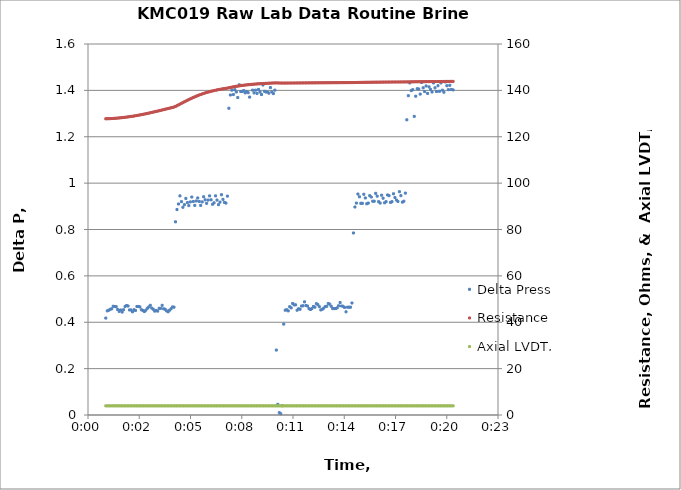
| Category | Delta Press |
|---|---|
| 0.0006944444444444445 | 0.418 |
| 0.0007523148137907912 | 0.449 |
| 0.0008101851904130955 | 0.452 |
| 0.0008680555597594422 | 0.456 |
| 0.0009259259291057889 | 0.458 |
| 0.0009837962984521357 | 0.469 |
| 0.0010416666677984824 | 0.468 |
| 0.0010995370371448291 | 0.467 |
| 0.0011574074064911758 | 0.455 |
| 0.0012152777831134802 | 0.447 |
| 0.0012731481524598269 | 0.453 |
| 0.0013310185218061736 | 0.444 |
| 0.0013888888911525203 | 0.454 |
| 0.001446759260498867 | 0.468 |
| 0.0015046296298452137 | 0.472 |
| 0.0015624999991915604 | 0.47 |
| 0.0016203703758138647 | 0.453 |
| 0.0016782407451602114 | 0.453 |
| 0.0017361111145065581 | 0.445 |
| 0.0017939814838529048 | 0.454 |
| 0.0018518518531992515 | 0.451 |
| 0.0019097222225455983 | 0.468 |
| 0.001967592591891945 | 0.468 |
| 0.0020254629685142493 | 0.466 |
| 0.002083333337860596 | 0.454 |
| 0.0021412037072069427 | 0.451 |
| 0.0021990740765532894 | 0.446 |
| 0.002256944445899636 | 0.452 |
| 0.002314814815245983 | 0.46 |
| 0.0023726851845923295 | 0.466 |
| 0.0024305555539386762 | 0.473 |
| 0.0024884259305609805 | 0.461 |
| 0.0025462962999073272 | 0.456 |
| 0.002604166669253674 | 0.448 |
| 0.0026620370386000207 | 0.451 |
| 0.0027199074079463674 | 0.448 |
| 0.002777777777292714 | 0.46 |
| 0.0028356481466390608 | 0.46 |
| 0.002893518523261365 | 0.473 |
| 0.002951388892607712 | 0.458 |
| 0.0030092592619540585 | 0.456 |
| 0.003067129631300405 | 0.449 |
| 0.003125000000646752 | 0.445 |
| 0.0031828703699930986 | 0.452 |
| 0.0032407407393394453 | 0.458 |
| 0.0032986111159617497 | 0.466 |
| 0.0033564814853080964 | 0.465 |
| 0.003414351854654443 | 0.833 |
| 0.0034722222240007898 | 0.886 |
| 0.0035300925933471365 | 0.91 |
| 0.003587962962693483 | 0.945 |
| 0.00364583333203983 | 0.92 |
| 0.003703703708662134 | 0.896 |
| 0.003761574078008481 | 0.907 |
| 0.0038194444473548276 | 0.934 |
| 0.0038773148167011743 | 0.916 |
| 0.003935185186047521 | 0.903 |
| 0.003993055555393868 | 0.919 |
| 0.0040509259247402144 | 0.94 |
| 0.004108796301362519 | 0.921 |
| 0.0041666666707088655 | 0.904 |
| 0.004224537040055212 | 0.923 |
| 0.004282407409401559 | 0.936 |
| 0.004340277778747906 | 0.921 |
| 0.004398148148094252 | 0.904 |
| 0.004456018517440599 | 0.919 |
| 0.004513888894062903 | 0.941 |
| 0.00457175926340925 | 0.928 |
| 0.004629629632755597 | 0.913 |
| 0.0046875000021019434 | 0.927 |
| 0.00474537037144829 | 0.945 |
| 0.004803240740794637 | 0.928 |
| 0.0048611111101409836 | 0.909 |
| 0.004918981486763288 | 0.915 |
| 0.004976851856109635 | 0.945 |
| 0.005034722225455981 | 0.927 |
| 0.005092592594802328 | 0.907 |
| 0.005150462964148675 | 0.918 |
| 0.005208333333495021 | 0.95 |
| 0.005266203702841368 | 0.93 |
| 0.0053240740794636724 | 0.917 |
| 0.005381944448810019 | 0.914 |
| 0.005439814818156366 | 0.944 |
| 0.0054976851875027126 | 1.323 |
| 0.005555555556849059 | 1.38 |
| 0.005613425926195406 | 1.401 |
| 0.005671296295541753 | 1.382 |
| 0.005729166672164057 | 1.403 |
| 0.005787037041510404 | 1.393 |
| 0.00584490741085675 | 1.369 |
| 0.005902777780203097 | 1.424 |
| 0.005960648149549444 | 1.395 |
| 0.0060185185188957905 | 1.395 |
| 0.006076388888242137 | 1.399 |
| 0.0061342592648644416 | 1.389 |
| 0.006192129634210788 | 1.395 |
| 0.006250000003557135 | 1.39 |
| 0.006307870372903482 | 1.371 |
| 0.006365740742249828 | 1.425 |
| 0.006423611111596175 | 1.401 |
| 0.006481481480942522 | 1.389 |
| 0.0065393518502888685 | 1.401 |
| 0.006597222226911173 | 1.387 |
| 0.0066550925962575195 | 1.404 |
| 0.006712962965603866 | 1.393 |
| 0.006770833334950213 | 1.382 |
| 0.00682870370429656 | 1.423 |
| 0.006886574073642906 | 1.396 |
| 0.006944444442989253 | 1.393 |
| 0.007002314819611557 | 1.393 |
| 0.007060185188957904 | 1.388 |
| 0.007118055558304251 | 1.412 |
| 0.0071759259276505975 | 1.393 |
| 0.007233796296996944 | 1.386 |
| 0.007291666666343291 | 1.401 |
| 0.007349537035689638 | 0.28 |
| 0.007407407412311942 | 0.046 |
| 0.007465277781658289 | 0.01 |
| 0.007523148151004635 | 0.005 |
| 0.007581018520350982 | 0.04 |
| 0.007638888889697329 | 0.392 |
| 0.0076967592590436755 | 0.452 |
| 0.007754629628390022 | 0.454 |
| 0.007812500005012327 | 0.449 |
| 0.007870370374358674 | 0.467 |
| 0.00792824074370502 | 0.462 |
| 0.007986111113051367 | 0.481 |
| 0.008043981482397714 | 0.475 |
| 0.008101851851744061 | 0.475 |
| 0.008159722221090408 | 0.452 |
| 0.008217592597712712 | 0.458 |
| 0.008275462967059059 | 0.456 |
| 0.008333333336405405 | 0.47 |
| 0.008391203705751752 | 0.471 |
| 0.008449074075098099 | 0.488 |
| 0.008506944444444445 | 0.472 |
| 0.008564814813790792 | 0.47 |
| 0.008622685190413096 | 0.459 |
| 0.008680555559759443 | 0.455 |
| 0.00873842592910579 | 0.459 |
| 0.008796296298452137 | 0.468 |
| 0.008854166667798483 | 0.465 |
| 0.00891203703714483 | 0.48 |
| 0.008969907406491177 | 0.476 |
| 0.009027777783113481 | 0.467 |
| 0.009085648152459828 | 0.453 |
| 0.009143518521806174 | 0.456 |
| 0.009201388891152521 | 0.461 |
| 0.009259259260498868 | 0.468 |
| 0.009317129629845215 | 0.469 |
| 0.009374999999191561 | 0.481 |
| 0.009432870375813866 | 0.478 |
| 0.009490740745160212 | 0.469 |
| 0.009548611114506559 | 0.459 |
| 0.009606481483852906 | 0.459 |
| 0.009664351853199252 | 0.459 |
| 0.009722222222545599 | 0.462 |
| 0.009780092591891946 | 0.471 |
| 0.00983796296851425 | 0.485 |
| 0.009895833337860597 | 0.47 |
| 0.009953703707206944 | 0.469 |
| 0.01001157407655329 | 0.464 |
| 0.010069444445899637 | 0.445 |
| 0.010127314815245984 | 0.465 |
| 0.01018518518459233 | 0.465 |
| 0.010243055553938677 | 0.465 |
| 0.010300925930560981 | 0.483 |
| 0.010358796299907328 | 0.785 |
| 0.010416666669253675 | 0.897 |
| 0.010474537038600022 | 0.914 |
| 0.010532407407946368 | 0.953 |
| 0.010590277777292715 | 0.941 |
| 0.010648148146639062 | 0.913 |
| 0.010706018523261366 | 0.913 |
| 0.010763888892607713 | 0.952 |
| 0.01082175926195406 | 0.936 |
| 0.010879629631300406 | 0.911 |
| 0.010937500000646753 | 0.914 |
| 0.0109953703699931 | 0.946 |
| 0.011053240739339446 | 0.94 |
| 0.01111111111596175 | 0.922 |
| 0.011168981485308097 | 0.922 |
| 0.011226851854654444 | 0.956 |
| 0.01128472222400079 | 0.944 |
| 0.011342592593347137 | 0.92 |
| 0.011400462962693484 | 0.914 |
| 0.01145833333203983 | 0.948 |
| 0.011516203708662135 | 0.935 |
| 0.011574074078008482 | 0.915 |
| 0.011631944447354828 | 0.92 |
| 0.011689814816701175 | 0.949 |
| 0.011747685186047522 | 0.946 |
| 0.011805555555393869 | 0.917 |
| 0.011863425924740215 | 0.92 |
| 0.01192129630136252 | 0.954 |
| 0.011979166670708866 | 0.938 |
| 0.012037037040055213 | 0.927 |
| 0.01209490740940156 | 0.921 |
| 0.012152777778747906 | 0.963 |
| 0.012210648148094253 | 0.946 |
| 0.0122685185174406 | 0.918 |
| 0.012326388894062904 | 0.922 |
| 0.012384259263409251 | 0.957 |
| 0.012442129632755598 | 1.273 |
| 0.012500000002101944 | 1.377 |
| 0.012557870371448291 | 1.432 |
| 0.012615740740794638 | 1.399 |
| 0.012673611110140984 | 1.403 |
| 0.012731481486763289 | 1.288 |
| 0.012789351856109635 | 1.375 |
| 0.012847222225455982 | 1.407 |
| 0.012905092594802329 | 1.406 |
| 0.012962962964148676 | 1.384 |
| 0.013020833333495022 | 1.434 |
| 0.013078703702841369 | 1.411 |
| 0.013136574079463673 | 1.395 |
| 0.01319444444881002 | 1.419 |
| 0.013252314818156367 | 1.387 |
| 0.013310185187502713 | 1.415 |
| 0.01336805555684906 | 1.404 |
| 0.013425925926195407 | 1.393 |
| 0.013483796295541754 | 1.432 |
| 0.013541666672164058 | 1.411 |
| 0.013599537041510405 | 1.395 |
| 0.013657407410856751 | 1.42 |
| 0.013715277780203098 | 1.396 |
| 0.013773148149549445 | 1.432 |
| 0.013831018518895791 | 1.401 |
| 0.013888888888242138 | 1.392 |
| 0.013946759264864442 | 1.436 |
| 0.014004629634210789 | 1.42 |
| 0.014062500003557136 | 1.403 |
| 0.014120370372903483 | 1.422 |
| 0.01417824074224983 | 1.404 |
| 0.014247685188375828 | 1.402 |